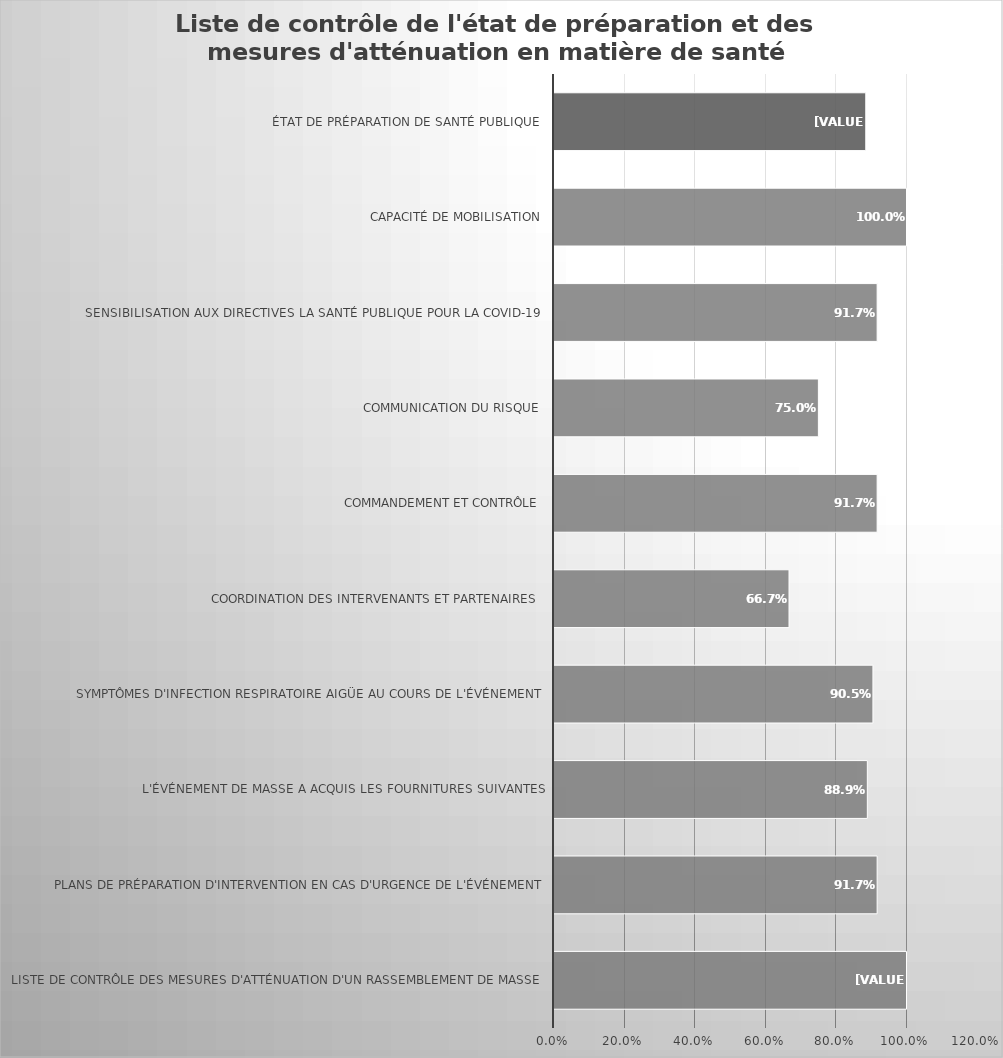
| Category | Percentage % |
|---|---|
| Liste de contrôle des mesures d'atténuation d'un rassemblement de masse  | 1 |
| Plans de préparation d'intervention en cas d'urgence de l'événement | 0.917 |
|  L'événement de masse a acquis les fournitures suivantes | 0.889 |
|  Symptômes d'infection respiratoire aigüe au cours de l'événement | 0.905 |
| Coordination des intervenants et partenaires  | 0.667 |
| Commandement et contrôle | 0.917 |
| Communication du risque | 0.75 |
| Sensibilisation aux directives la santé publique pour la COVID-19  | 0.917 |
| Capacité de mobilisation | 1 |
| État de préparation de santé publique | 0.884 |